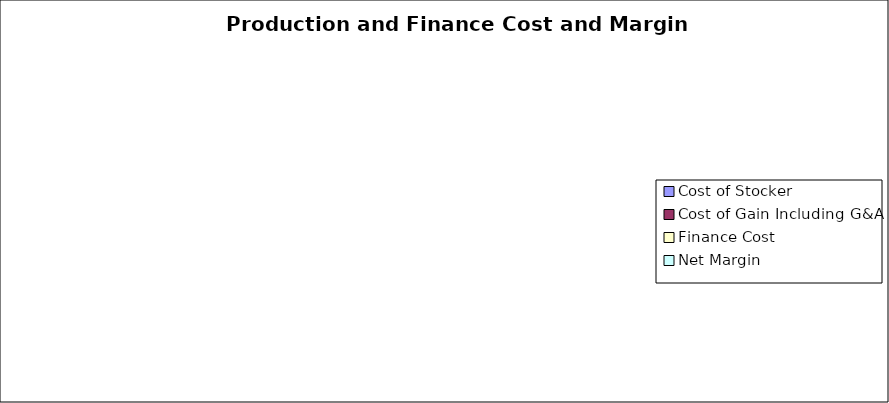
| Category | $/Head |
|---|---|
| Cost of Stocker | 0 |
| Cost of Gain Including G&A | 0 |
| Finance Cost | 0 |
| Net Margin | 0 |